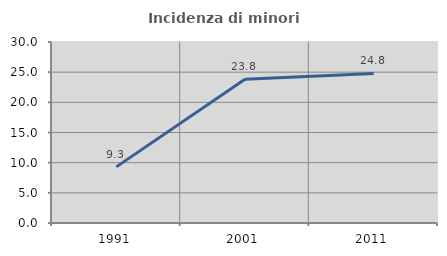
| Category | Incidenza di minori stranieri |
|---|---|
| 1991.0 | 9.302 |
| 2001.0 | 23.826 |
| 2011.0 | 24.788 |